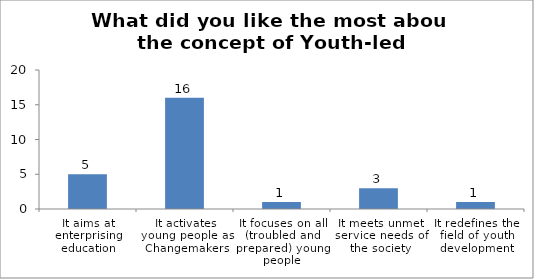
| Category | What did you like the most about the concept of Youth-led Changemaking? |
|---|---|
| It aims at enterprising education | 5 |
| It activates young people as Changemakers | 16 |
| It focuses on all (troubled and prepared) young people | 1 |
| It meets unmet service needs of the society | 3 |
| It redefines the field of youth development | 1 |